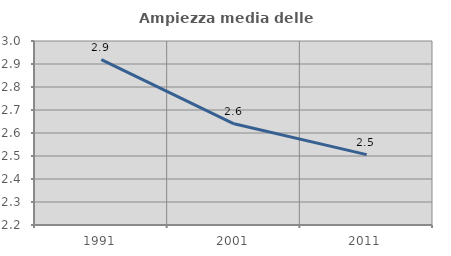
| Category | Ampiezza media delle famiglie |
|---|---|
| 1991.0 | 2.919 |
| 2001.0 | 2.64 |
| 2011.0 | 2.506 |